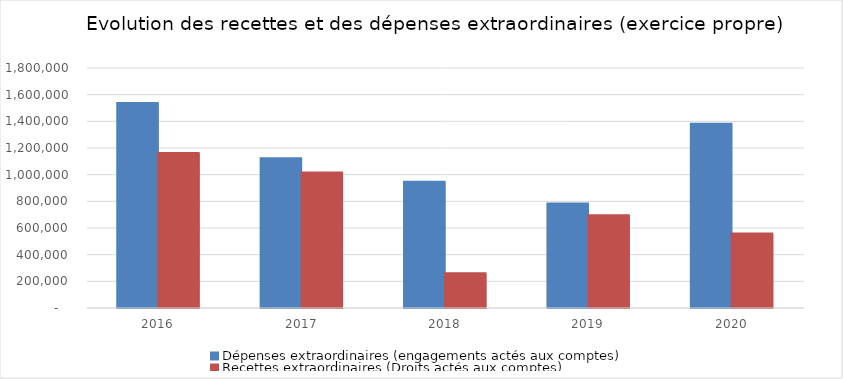
| Category | Dépenses extraordinaires (engagements actés aux comptes) | Recettes extraordinaires (Droits actés aux comptes) |
|---|---|---|
| 2016.0 | 1534225.76 | 1159067.95 |
| 2017.0 | 1119270.73 | 1012038.15 |
| 2018.0 | 942505.8 | 257676.58 |
| 2019.0 | 779247.36 | 691005.25 |
| 2020.0 | 1379060.62 | 555060.95 |